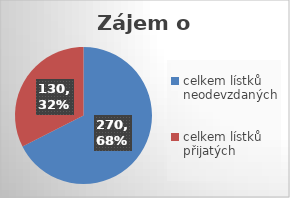
| Category | Počet čísel popisných (rozdaných lístků) |
|---|---|
| celkem lístků neodevzdaných | 270 |
| celkem lístků přijatých | 130 |